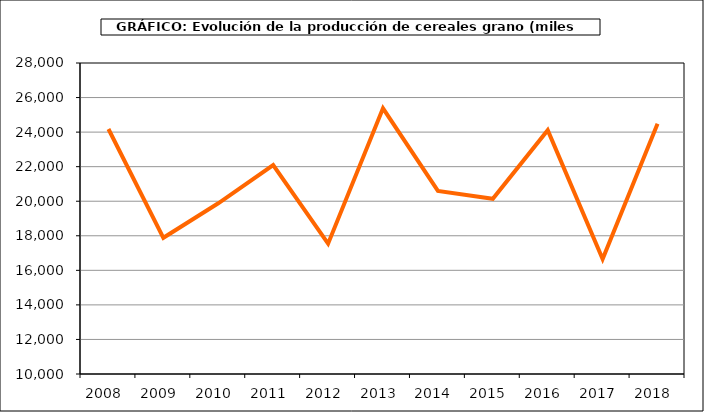
| Category | Produccion |
|---|---|
| 2008.0 | 24179.755 |
| 2009.0 | 17884.219 |
| 2010.0 | 19880.065 |
| 2011.0 | 22094.521 |
| 2012.0 | 17543.823 |
| 2013.0 | 25374.359 |
| 2014.0 | 20596.94 |
| 2015.0 | 20140.943 |
| 2016.0 | 24114.796 |
| 2017.0 | 16658.841 |
| 2018.0 | 24490.855 |